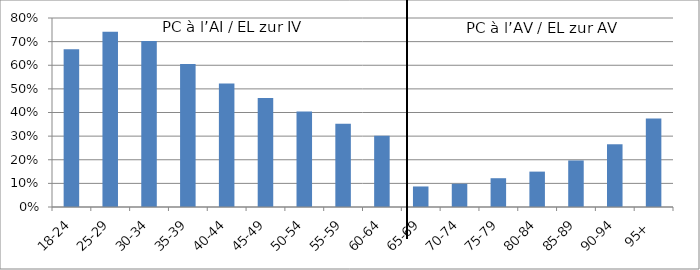
| Category | PC à l’AI / EL zur IV PC à l’AV / EL zur AV |
|---|---|
| 18-24 | 0.668 |
| 25-29 | 0.742 |
| 30-34 | 0.703 |
| 35-39 | 0.605 |
| 40-44 | 0.523 |
| 45-49 | 0.462 |
| 50-54 | 0.405 |
| 55-59 | 0.353 |
| 60-64 | 0.302 |
| 65-69 | 0.087 |
| 70-74 | 0.098 |
| 75-79 | 0.122 |
| 80-84 | 0.15 |
| 85-89 | 0.197 |
| 90-94 | 0.266 |
| 95+ | 0.374 |